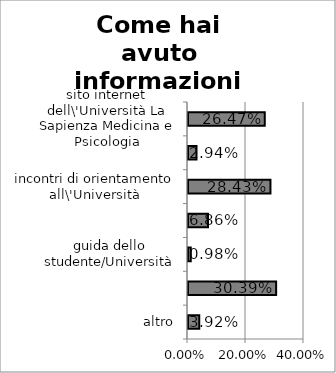
| Category | Totale |
|---|---|
| altro | 0.039 |
| amici o conoscenti | 0.304 |
| guida dello studente/Università | 0.01 |
| incontri di orientamento a scuola | 0.069 |
| incontri di orientamento all\'Università | 0.284 |
| manifesto degli studi | 0.029 |
| sito internet dell\'Università La Sapienza Medicina e Psicologia | 0.265 |